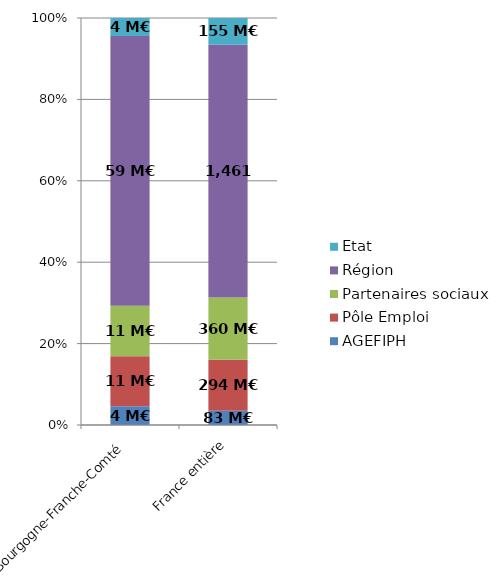
| Category | AGEFIPH | Pôle Emploi | Partenaires sociaux | Région | Etat |
|---|---|---|---|---|---|
| Bourgogne-Franche-Comté | 4.121 | 10.989 | 11.088 | 59.207 | 3.94 |
| France entière | 82.716 | 293.959 | 359.593 | 1461.057 | 154.74 |